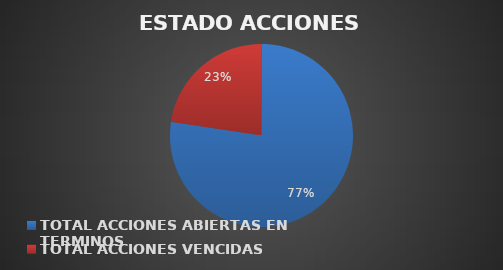
| Category | Series 0 |
|---|---|
| TOTAL ACCIONES ABIERTAS EN TERMINOS | 65 |
| TOTAL ACCIONES VENCIDAS | 19 |